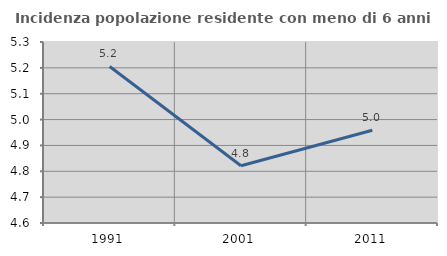
| Category | Incidenza popolazione residente con meno di 6 anni |
|---|---|
| 1991.0 | 5.205 |
| 2001.0 | 4.821 |
| 2011.0 | 4.959 |